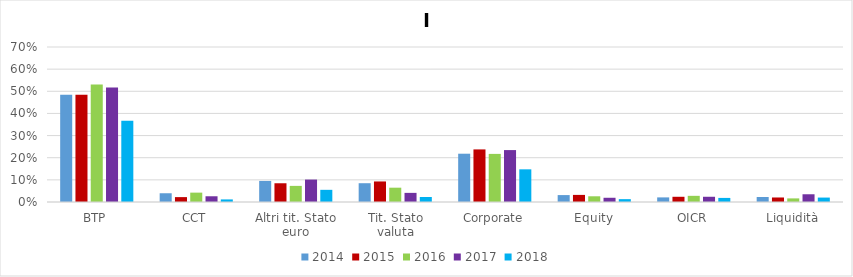
| Category | 2014 | 2015 | 2016 | 2017 | 2018 |
|---|---|---|---|---|---|
| BTP | 0.485 | 0.485 | 0.531 | 0.518 | 0.367 |
| CCT | 0.04 | 0.022 | 0.042 | 0.026 | 0.012 |
| Altri tit. Stato euro | 0.095 | 0.085 | 0.073 | 0.101 | 0.055 |
| Tit. Stato valuta | 0.085 | 0.093 | 0.065 | 0.041 | 0.023 |
| Corporate | 0.218 | 0.238 | 0.217 | 0.234 | 0.148 |
| Equity | 0.031 | 0.032 | 0.026 | 0.019 | 0.013 |
| OICR | 0.021 | 0.024 | 0.028 | 0.024 | 0.018 |
| Liquidità | 0.023 | 0.02 | 0.016 | 0.035 | 0.02 |